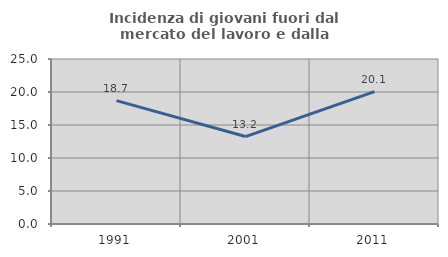
| Category | Incidenza di giovani fuori dal mercato del lavoro e dalla formazione  |
|---|---|
| 1991.0 | 18.687 |
| 2001.0 | 13.249 |
| 2011.0 | 20.067 |